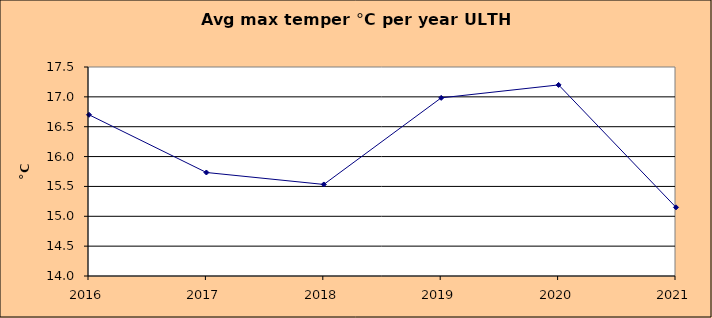
| Category | Series 0 |
|---|---|
| 2016.0 | 16.7 |
| 2017.0 | 15.733 |
| 2018.0 | 15.533 |
| 2019.0 | 16.983 |
| 2020.0 | 17.2 |
| 2021.0 | 15.15 |